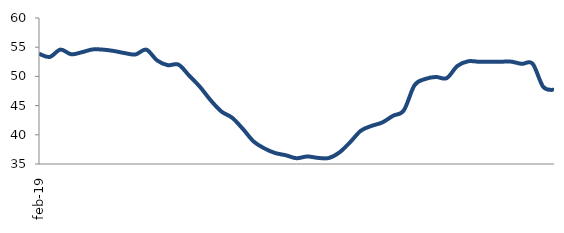
| Category | Series 0 |
|---|---|
| 2019-02-01 | 53.876 |
| 2019-03-01 | 53.327 |
| 2019-04-01 | 54.589 |
| 2019-05-01 | 53.785 |
| 2019-06-01 | 54.141 |
| 2019-07-01 | 54.62 |
| 2019-08-01 | 54.58 |
| 2019-09-01 | 54.344 |
| 2019-10-01 | 53.985 |
| 2019-11-01 | 53.756 |
| 2019-12-01 | 54.579 |
| 2020-01-01 | 52.748 |
| 2020-02-01 | 51.924 |
| 2020-03-01 | 52.017 |
| 2020-04-01 | 50.123 |
| 2020-05-01 | 48.215 |
| 2020-06-01 | 45.912 |
| 2020-07-01 | 43.989 |
| 2020-08-01 | 42.923 |
| 2020-09-01 | 41.015 |
| 2020-10-01 | 38.867 |
| 2020-11-01 | 37.678 |
| 2020-12-01 | 36.885 |
| 2021-01-01 | 36.497 |
| 2021-02-01 | 35.988 |
| 2021-03-01 | 36.29 |
| 2021-04-01 | 36.047 |
| 2021-05-01 | 36.023 |
| 2021-06-01 | 36.982 |
| 2021-07-01 | 38.733 |
| 2021-08-01 | 40.7 |
| 2021-09-01 | 41.525 |
| 2021-10-01 | 42.118 |
| 2021-11-01 | 43.262 |
| 2021-12-01 | 44.177 |
| 2022-01-01 | 48.481 |
| 2022-02-01 | 49.558 |
| 2022-03-01 | 49.904 |
| 2022-04-01 | 49.706 |
| 2022-05-01 | 51.792 |
| 2022-06-01 | 52.589 |
| 2022-07-01 | 52.508 |
| 2022-08-01 | 52.513 |
| 2022-09-01 | 52.513 |
| 2022-10-01 | 52.526 |
| 2022-11-01 | 52.149 |
| 2022-12-01 | 52.184 |
| 2023-01-01 | 48.201 |
| 2023-02-01 | 47.68 |